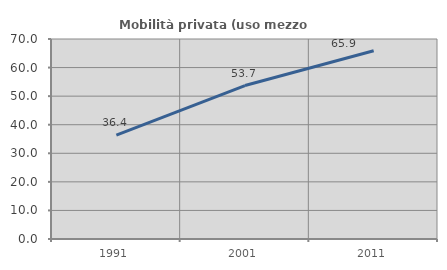
| Category | Mobilità privata (uso mezzo privato) |
|---|---|
| 1991.0 | 36.364 |
| 2001.0 | 53.704 |
| 2011.0 | 65.909 |